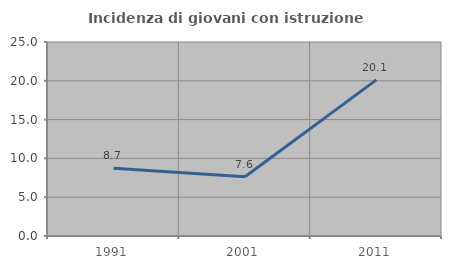
| Category | Incidenza di giovani con istruzione universitaria |
|---|---|
| 1991.0 | 8.725 |
| 2001.0 | 7.634 |
| 2011.0 | 20.118 |